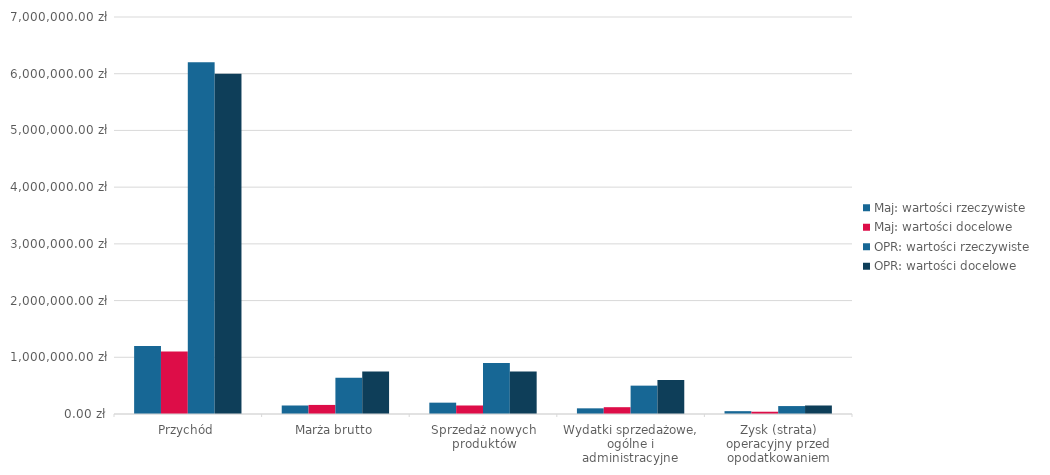
| Category | Maj: wartości rzeczywiste | Maj: wartości docelowe | OPR: wartości rzeczywiste | OPR: wartości docelowe |
|---|---|---|---|---|
| Przychód | 1200000 | 1100000 | 6200000 | 6000000 |
| Marża brutto | 150000 | 160000 | 640000 | 750000 |
| Sprzedaż nowych produktów | 200000 | 150000 | 900000 | 750000 |
| Wydatki sprzedażowe, ogólne i administracyjne | 100000 | 120000 | 500000 | 600000 |
| Zysk (strata) operacyjny przed opodatkowaniem | 50000 | 40000 | 140000 | 150000 |